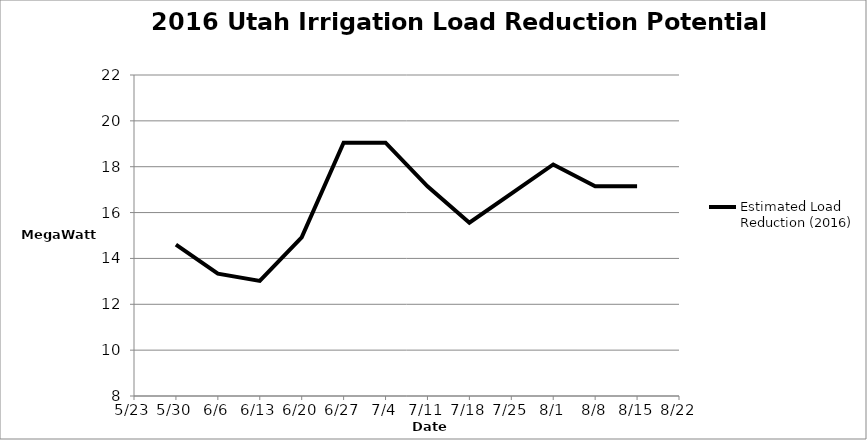
| Category | Estimated Load Reduction (2016) |
|---|---|
| 42520.0 | 14.605 |
| 42527.0 | 13.335 |
| 42534.0 | 13.018 |
| 42541.0 | 14.922 |
| 42548.0 | 19.05 |
| 42555.0 | 19.05 |
| 42562.0 | 17.145 |
| 42569.0 | 15.558 |
| 42576.0 | 16.828 |
| 42583.0 | 18.098 |
| 42590.0 | 17.145 |
| 42597.0 | 17.145 |